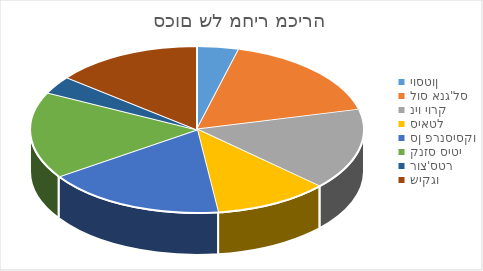
| Category | סה"כ |
|---|---|
| יוסטון | 3671 |
| לוס אנג'לס | 15424 |
| ניו יורק | 14197 |
| סיאטל | 9990 |
| סן פרנסיסקו | 15800 |
| קנזס סיטי | 15163 |
| רוצ'סטר | 3095 |
| שיקגו | 12852 |